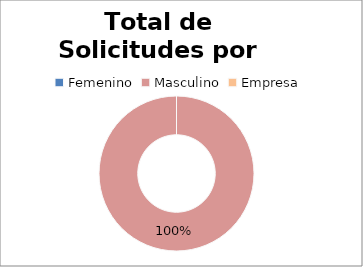
| Category | Series 0 |
|---|---|
| 0 | 0 |
| 1 | 8 |
| 2 | 0 |